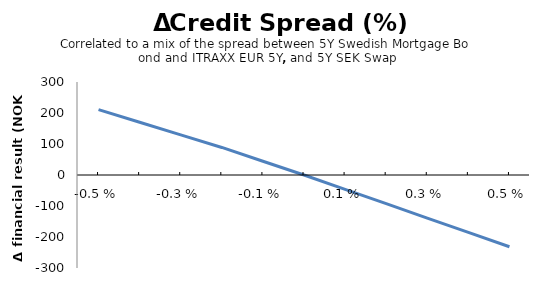
| Category | Series 0 |
|---|---|
| -0.005 | 210.988 |
| -0.004 | 170.281 |
| -0.003 | 129.574 |
| -0.002 | 88.867 |
| -0.001 | 44.242 |
| 0.0 | 0 |
| 0.001 | -46.287 |
| 0.002 | -92.574 |
| 0.003 | -138.86 |
| 0.004 | -185.147 |
| 0.005 | -231.434 |